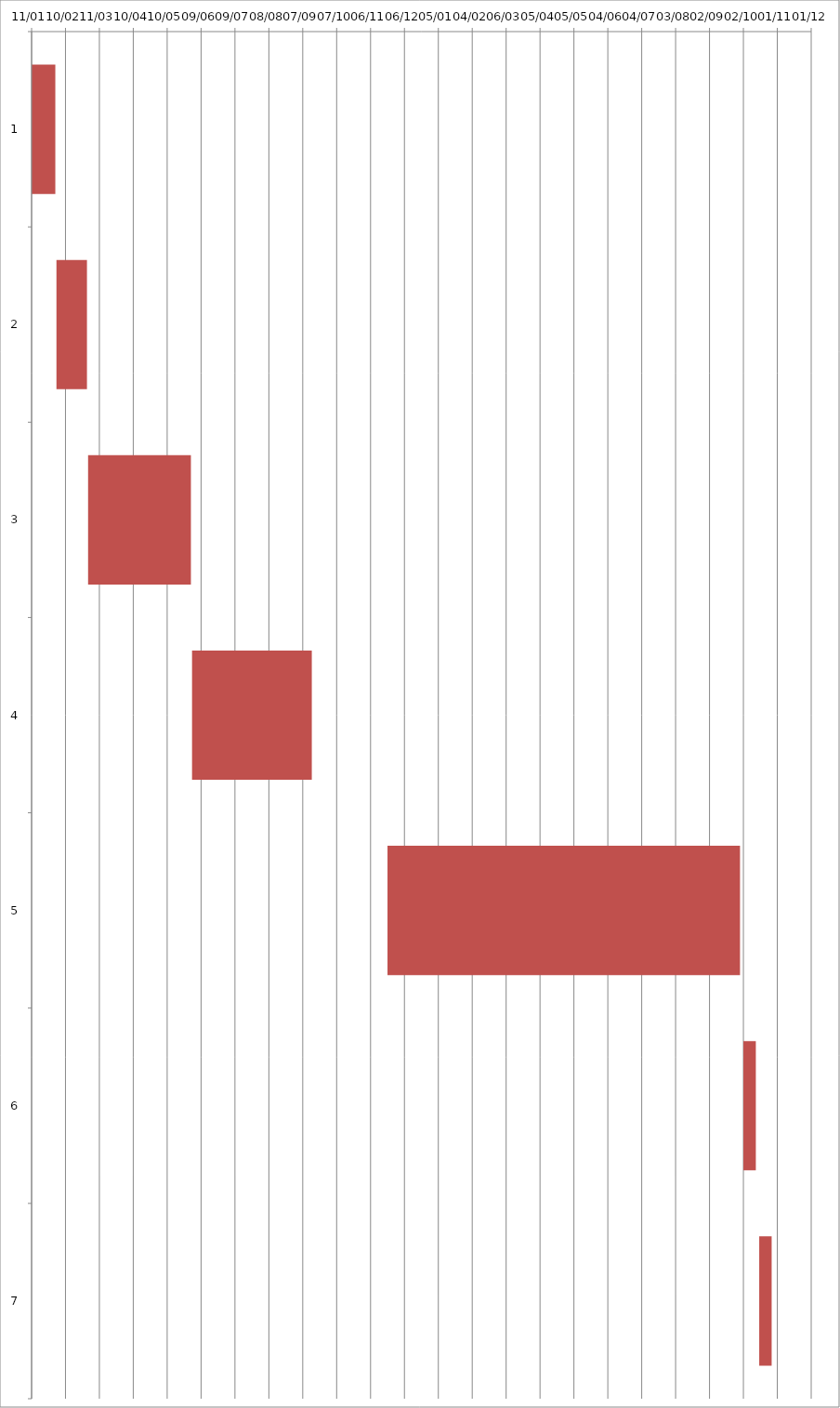
| Category | Fecha de inicio | DURACIÓN |
|---|---|---|
| 0 | 1/11/16 | 21 |
| 1 | 2/2/16 | 27 |
| 2 | 3/1/16 | 91 |
| 3 | 6/1/16 | 106 |
| 4 | 11/21/16 | 312 |
| 5 | 10/2/17 | 11 |
| 6 | 10/16/17 | 11 |